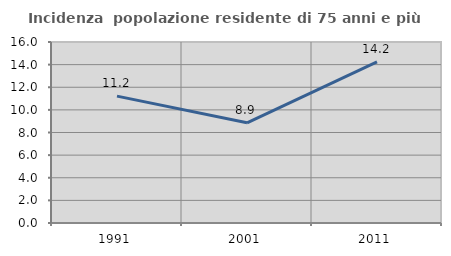
| Category | Incidenza  popolazione residente di 75 anni e più |
|---|---|
| 1991.0 | 11.216 |
| 2001.0 | 8.859 |
| 2011.0 | 14.237 |